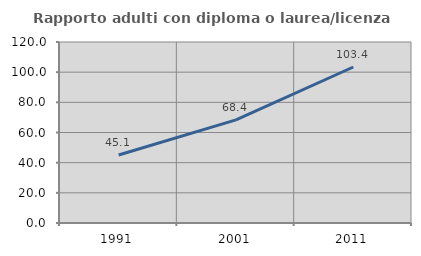
| Category | Rapporto adulti con diploma o laurea/licenza media  |
|---|---|
| 1991.0 | 45.091 |
| 2001.0 | 68.376 |
| 2011.0 | 103.423 |